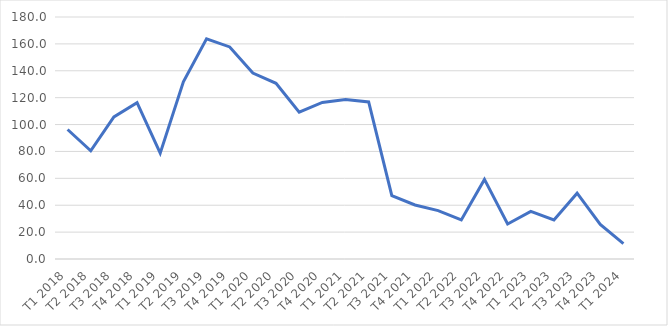
| Category | Series 0 |
|---|---|
| T1 2018 | 96.329 |
| T2 2018 | 80.519 |
| T3 2018 | 105.66 |
| T4 2018 | 116.286 |
| T1 2019 | 78.73 |
| T2 2019 | 131.845 |
| T3 2019 | 163.766 |
| T4 2019 | 157.746 |
| T1 2020 | 138.268 |
| T2 2020 | 130.718 |
| T3 2020 | 109.175 |
| T4 2020 | 116.447 |
| T1 2021 | 118.61 |
| T2 2021 | 116.792 |
| T3 2021 | 47.126 |
| T4 2021 | 40.192 |
| T1 2022 | 36.031 |
| T2 2022 | 29.069 |
| T3 2022 | 59.184 |
| T4 2022 | 26.017 |
| T1 2023 | 35.421 |
| T2 2023 | 29.069 |
| T3 2023 | 48.967 |
| T4 2023 | 25.759 |
| T1 2024 | 11.443 |